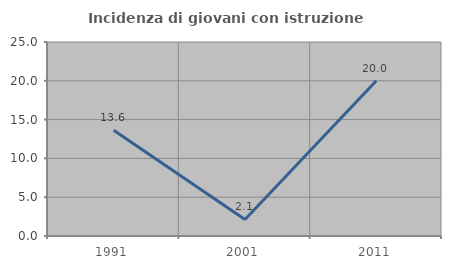
| Category | Incidenza di giovani con istruzione universitaria |
|---|---|
| 1991.0 | 13.636 |
| 2001.0 | 2.128 |
| 2011.0 | 20 |